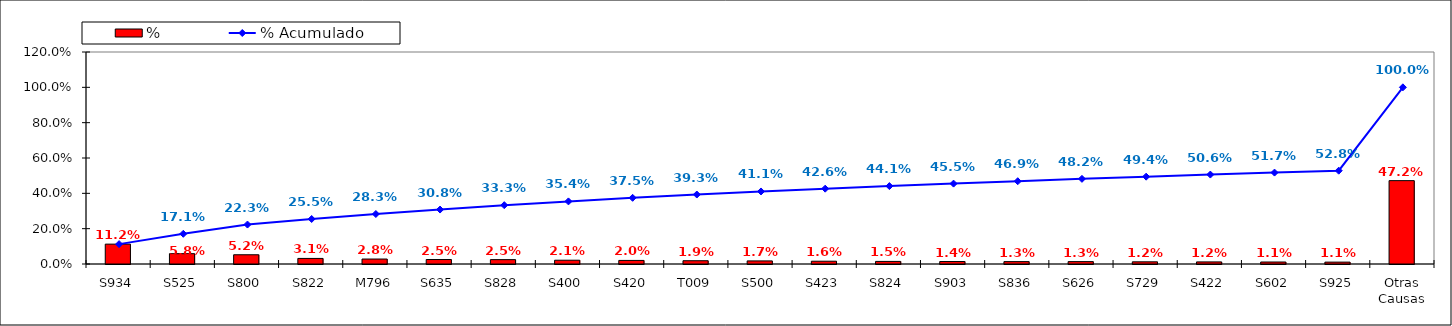
| Category | % |
|---|---|
| S934 | 0.112 |
| S525 | 0.058 |
| S800 | 0.052 |
| S822 | 0.031 |
| M796 | 0.028 |
| S635 | 0.025 |
| S828 | 0.025 |
| S400 | 0.021 |
| S420 | 0.02 |
| T009 | 0.019 |
| S500 | 0.017 |
| S423 | 0.016 |
| S824 | 0.015 |
| S903 | 0.014 |
| S836 | 0.013 |
| S626 | 0.013 |
| S729 | 0.012 |
| S422 | 0.012 |
| S602 | 0.011 |
| S925 | 0.011 |
| Otras Causas | 0.472 |